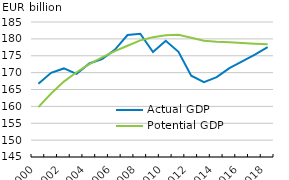
| Category | Actual GDP | Potential GDP |
|---|---|---|
| 2000.0 | 166.695 | 159.796 |
| 2001.0 | 169.934 | 163.825 |
| 2002.0 | 171.241 | 167.338 |
| 2003.0 | 169.641 | 170.117 |
| 2004.0 | 172.714 | 172.508 |
| 2005.0 | 174.038 | 174.542 |
| 2006.0 | 176.741 | 176.355 |
| 2007.0 | 181.146 | 177.971 |
| 2008.0 | 181.507 | 179.56 |
| 2009.0 | 176.101 | 180.483 |
| 2010.0 | 179.445 | 181.055 |
| 2011.0 | 176.167 | 181.216 |
| 2012.0 | 169.07 | 180.357 |
| 2013.0 | 167.159 | 179.455 |
| 2014.0 | 168.652 | 179.116 |
| 2015.0 | 171.343 | 178.97 |
| 2016.0 | 173.329 | 178.793 |
| 2017.0 | 175.336 | 178.574 |
| 2018.0 | 177.557 | 178.386 |